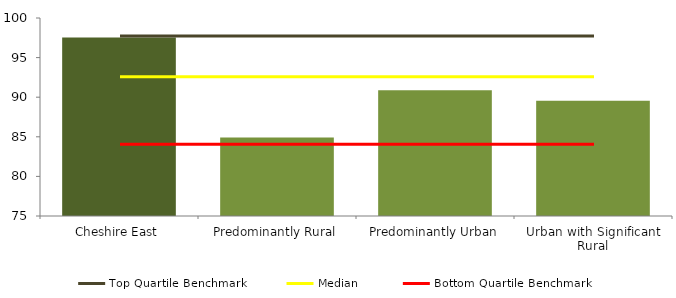
| Category | Series 0 |
|---|---|
| Cheshire East | 97.541 |
| Predominantly Rural | 84.896 |
| Predominantly Urban | 90.863 |
| Urban with Significant Rural | 89.536 |